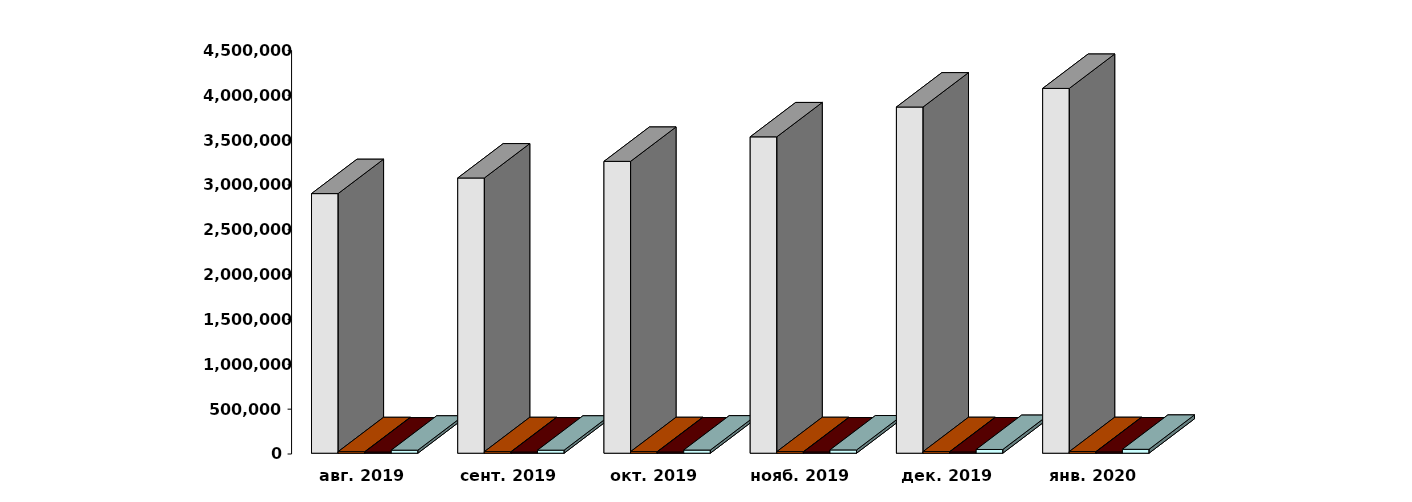
| Category | Физические лица | Юридические лица | Иностранные лица | Клиенты, передавшие свои средства в ДУ |
|---|---|---|---|---|
| 2019-08-30 | 2894450 | 17007 | 12945 | 33858 |
| 2019-09-30 | 3068547 | 17183 | 13213 | 33842 |
| 2019-10-30 | 3253953 | 17389 | 13455 | 35116 |
| 2019-11-30 | 3527188 | 17527 | 13688 | 36567 |
| 2019-12-31 | 3859911 | 17695 | 14011 | 41535 |
| 2020-01-31 | 4067317 | 17706 | 14182 | 43400 |